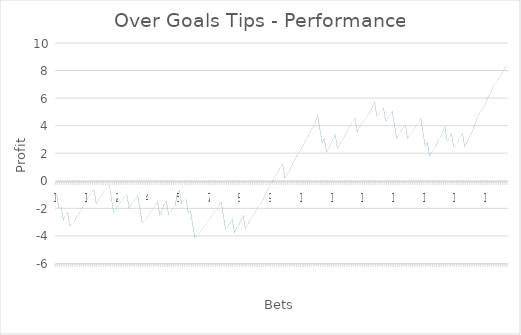
| Category | Balance |
|---|---|
| 0 | -1 |
| 1 | -2 |
| 2 | -1.87 |
| 3 | -2.87 |
| 4 | -2.54 |
| 5 | -2.33 |
| 6 | -3.33 |
| 7 | -3.13 |
| 8 | -3 |
| 9 | -2.64 |
| 10 | -2.48 |
| 11 | -2.18 |
| 12 | -1.85 |
| 13 | -1.7 |
| 14 | -1.37 |
| 15 | -1.08 |
| 16 | -0.86 |
| 17 | -0.66 |
| 18 | -1.66 |
| 19 | -1.41 |
| 20 | -1.19 |
| 21 | -0.94 |
| 22 | -0.69 |
| 23 | -0.51 |
| 24 | -0.34 |
| 25 | -1.34 |
| 26 | -2.34 |
| 27 | -2.09 |
| 28 | -1.79 |
| 29 | -1.61 |
| 30 | -1.39 |
| 31 | -1.11 |
| 32 | -1.01 |
| 33 | -2.01 |
| 34 | -1.71 |
| 35 | -1.54 |
| 36 | -1.33 |
| 37 | -1.1 |
| 38 | -2.1 |
| 39 | -3.1 |
| 40 | -2.92 |
| 41 | -2.73 |
| 42 | -2.49 |
| 43 | -2.23 |
| 44 | -2.02 |
| 45 | -1.81 |
| 46 | -1.53 |
| 47 | -2.53 |
| 48 | -2.17 |
| 49 | -1.73 |
| 50 | -1.47 |
| 51 | -2.47 |
| 52 | -2.29 |
| 53 | -2.03 |
| 54 | -1.83 |
| 55 | -0.95 |
| 56 | -0.71 |
| 57 | -1.71 |
| 58 | -1.48 |
| 59 | -1.35 |
| 60 | -2.35 |
| 61 | -2.2 |
| 62 | -3.2 |
| 63 | -4.2 |
| 64 | -3.98 |
| 65 | -3.81 |
| 66 | -3.61 |
| 67 | -3.38 |
| 68 | -3.19 |
| 69 | -2.97 |
| 70 | -2.77 |
| 71 | -2.48 |
| 72 | -2.26 |
| 73 | -2.06 |
| 74 | -1.84 |
| 75 | -1.55 |
| 76 | -2.55 |
| 77 | -3.55 |
| 78 | -3.35 |
| 79 | -3.08 |
| 80 | -2.79 |
| 81 | -3.79 |
| 82 | -3.44 |
| 83 | -3.26 |
| 84 | -2.86 |
| 85 | -2.53 |
| 86 | -3.53 |
| 87 | -3.24 |
| 88 | -2.91 |
| 89 | -2.69 |
| 90 | -2.4 |
| 91 | -2.15 |
| 92 | -1.9 |
| 93 | -1.7 |
| 94 | -1.45 |
| 95 | -1.07 |
| 96 | -0.71 |
| 97 | -0.45 |
| 98 | -0.17 |
| 99 | 0.12 |
| 100 | 0.42 |
| 101 | 0.62 |
| 102 | 0.98 |
| 103 | 1.18 |
| 104 | 0.18 |
| 105 | 0.43 |
| 106 | 0.68 |
| 107 | 0.97 |
| 108 | 1.37 |
| 109 | 1.66 |
| 110 | 1.96 |
| 111 | 2.18 |
| 112 | 2.47 |
| 113 | 2.76 |
| 114 | 3.04 |
| 115 | 3.34 |
| 116 | 3.63 |
| 117 | 3.93 |
| 118 | 4.26 |
| 119 | 4.73 |
| 120 | 3.73 |
| 121 | 2.73 |
| 122 | 3.06 |
| 123 | 2.06 |
| 124 | 2.37 |
| 125 | 2.67 |
| 126 | 3.03 |
| 127 | 3.33 |
| 128 | 2.33 |
| 129 | 2.59 |
| 130 | 2.88 |
| 131 | 3.13 |
| 132 | 3.43 |
| 133 | 3.79 |
| 134 | 4.06 |
| 135 | 4.31 |
| 136 | 4.53 |
| 137 | 3.53 |
| 138 | 3.83 |
| 139 | 4.13 |
| 140 | 4.33 |
| 141 | 4.53 |
| 142 | 4.75 |
| 143 | 5.05 |
| 144 | 5.34 |
| 145 | 5.64 |
| 146 | 4.64 |
| 147 | 4.86 |
| 148 | 5.06 |
| 149 | 5.28 |
| 150 | 4.28 |
| 151 | 4.57 |
| 152 | 4.79 |
| 153 | 5.04 |
| 154 | 4.04 |
| 155 | 3.04 |
| 156 | 3.34 |
| 157 | 3.55 |
| 158 | 3.84 |
| 159 | 4.04 |
| 160 | 3.04 |
| 161 | 3.29 |
| 162 | 3.47 |
| 163 | 3.72 |
| 164 | 3.98 |
| 165 | 4.18 |
| 166 | 4.49 |
| 167 | 3.49 |
| 168 | 2.49 |
| 169 | 2.78 |
| 170 | 1.78 |
| 171 | 2.05 |
| 172 | 2.3 |
| 173 | 2.55 |
| 174 | 2.95 |
| 175 | 3.15 |
| 176 | 3.55 |
| 177 | 3.88 |
| 178 | 2.88 |
| 179 | 3.1 |
| 180 | 3.4 |
| 181 | 2.4 |
| 182 | 2.62 |
| 183 | 2.84 |
| 184 | 3.17 |
| 185 | 3.44 |
| 186 | 2.44 |
| 187 | 2.77 |
| 188 | 3.1 |
| 189 | 3.39 |
| 190 | 3.75 |
| 191 | 4.25 |
| 192 | 4.65 |
| 193 | 4.94 |
| 194 | 5.16 |
| 195 | 5.41 |
| 196 | 5.81 |
| 197 | 6.14 |
| 198 | 6.44 |
| 199 | 6.84 |
| 200 | 7.04 |
| 201 | 7.26 |
| 202 | 7.51 |
| 203 | 7.76 |
| 204 | 8.06 |
| 205 | 8.32 |